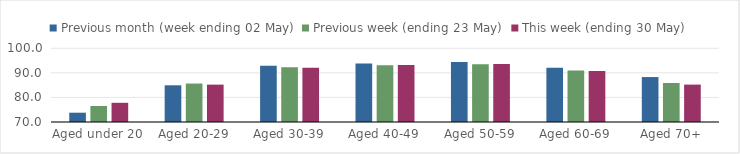
| Category | Previous month (week ending 02 May) | Previous week (ending 23 May) | This week (ending 30 May) |
|---|---|---|---|
| Aged under 20 | 73.784 | 76.511 | 77.814 |
| Aged 20-29 | 84.937 | 85.653 | 85.211 |
| Aged 30-39 | 92.858 | 92.236 | 92.114 |
| Aged 40-49 | 93.826 | 93.076 | 93.206 |
| Aged 50-59 | 94.373 | 93.526 | 93.577 |
| Aged 60-69 | 92.064 | 90.992 | 90.788 |
| Aged 70+ | 88.286 | 85.861 | 85.224 |